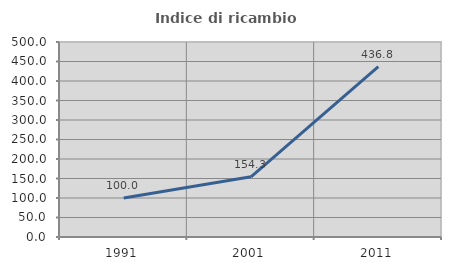
| Category | Indice di ricambio occupazionale  |
|---|---|
| 1991.0 | 100 |
| 2001.0 | 154.286 |
| 2011.0 | 436.842 |